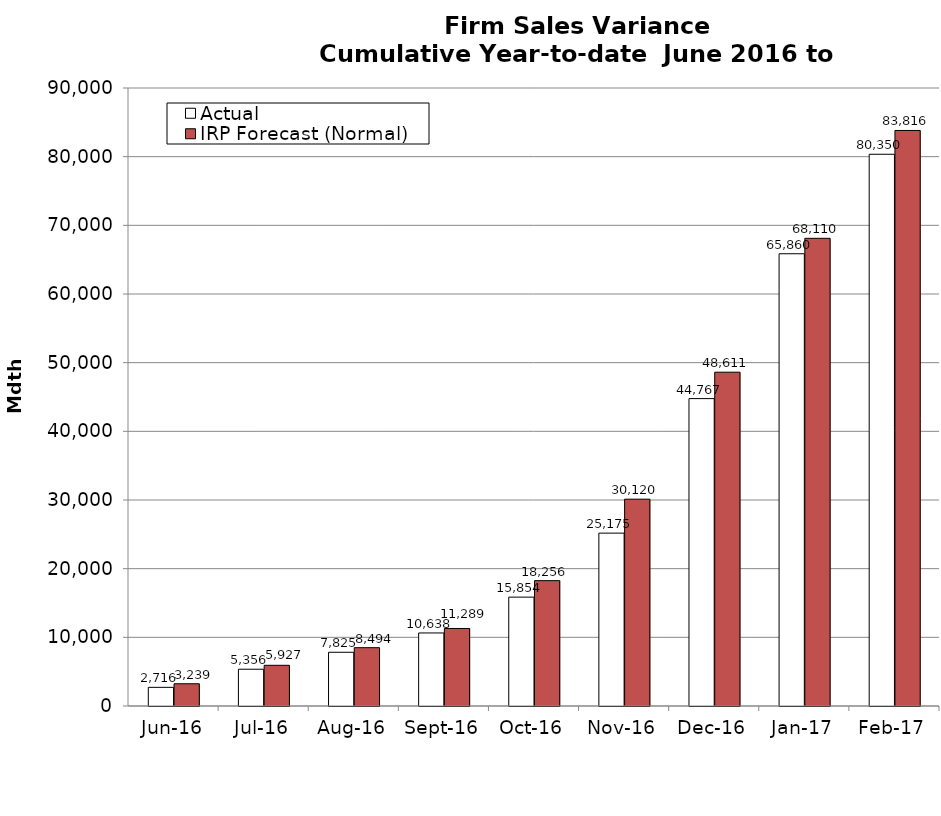
| Category | Actual | IRP Forecast (Normal) |
|---|---|---|
| 2016-06-01 | 2715.814 | 3238.888 |
| 2016-07-01 | 5356.131 | 5926.925 |
| 2016-08-01 | 7825.116 | 8494.37 |
| 2016-09-01 | 10637.764 | 11288.736 |
| 2016-10-01 | 15853.744 | 18255.76 |
| 2016-11-01 | 25174.725 | 30119.645 |
| 2016-12-01 | 44766.853 | 48611.47 |
| 2017-01-01 | 65860.33 | 68109.679 |
| 2017-02-01 | 80350.073 | 83816.192 |